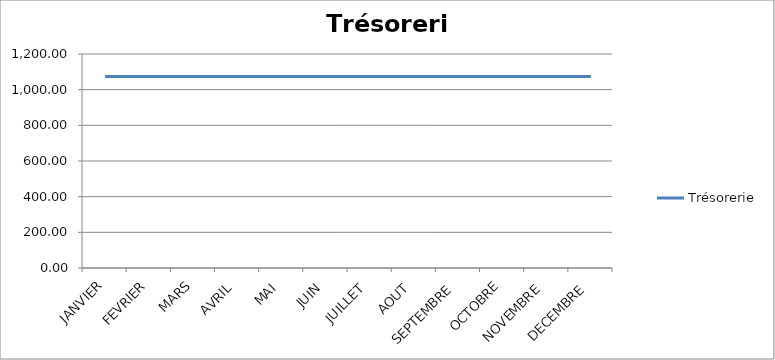
| Category | Trésorerie |
|---|---|
| JANVIER | 1074 |
| FEVRIER | 1074 |
| MARS | 1074 |
| AVRIL | 1074 |
| MAI | 1074 |
| JUIN | 1074 |
| JUILLET | 1074 |
| AOUT | 1074 |
| SEPTEMBRE | 1074 |
| OCTOBRE | 1074 |
| NOVEMBRE | 1074 |
| DECEMBRE | 1074 |